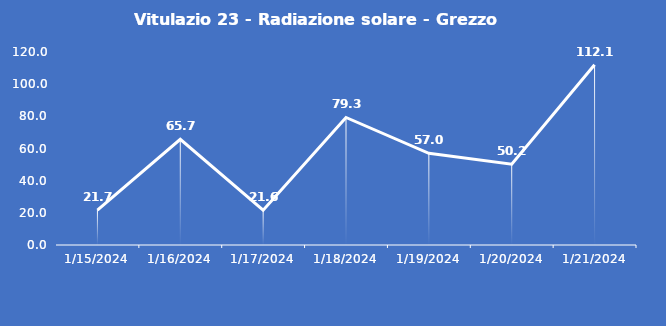
| Category | Vitulazio 23 - Radiazione solare - Grezzo (W/m2) |
|---|---|
| 1/15/24 | 21.7 |
| 1/16/24 | 65.7 |
| 1/17/24 | 21.6 |
| 1/18/24 | 79.3 |
| 1/19/24 | 57 |
| 1/20/24 | 50.2 |
| 1/21/24 | 112.1 |